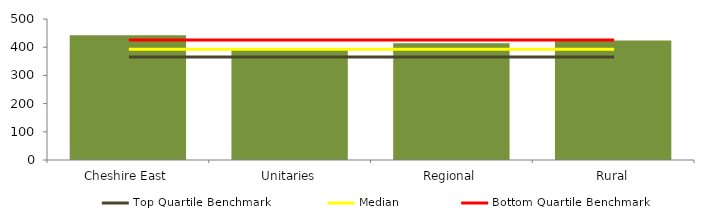
| Category | Block Data |
|---|---|
| Cheshire East | 442.4 |
| Unitaries | 394.49 |
| Regional | 414.133 |
|  Rural  | 424.125 |